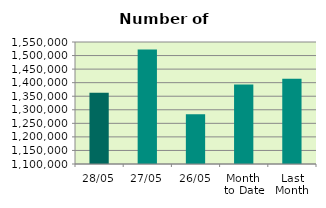
| Category | Series 0 |
|---|---|
| 28/05 | 1362726 |
| 27/05 | 1522228 |
| 26/05 | 1283190 |
| Month 
to Date | 1392862.8 |
| Last
Month | 1414476.2 |